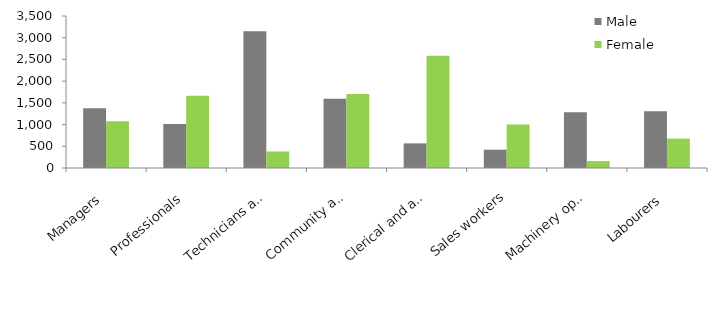
| Category | Male | Female |
|---|---|---|
| Managers | 1377 | 1079 |
| Professionals | 1015 | 1665 |
| Technicians and trades workers | 3146 | 381 |
| Community and personal service workers | 1595 | 1704 |
| Clerical and administrative workers | 567 | 2583 |
| Sales workers | 421 | 1000 |
| Machinery operators and drivers | 1285 | 159 |
| Labourers | 1306 | 677 |